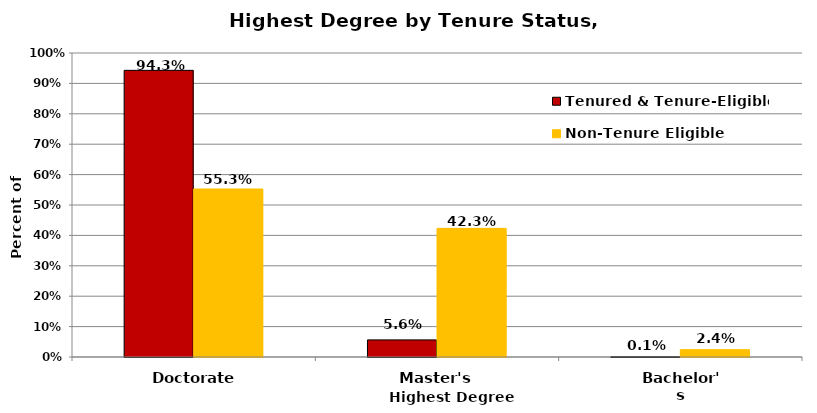
| Category | Tenured & Tenure-Eligible | Non-Tenure Eligible |
|---|---|---|
| Doctorate | 0.943 | 0.553 |
| Master's | 0.056 | 0.423 |
| Bachelor's | 0.001 | 0.024 |